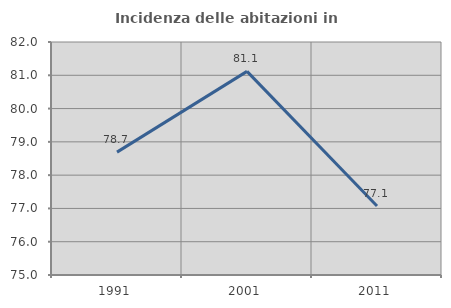
| Category | Incidenza delle abitazioni in proprietà  |
|---|---|
| 1991.0 | 78.692 |
| 2001.0 | 81.118 |
| 2011.0 | 77.071 |